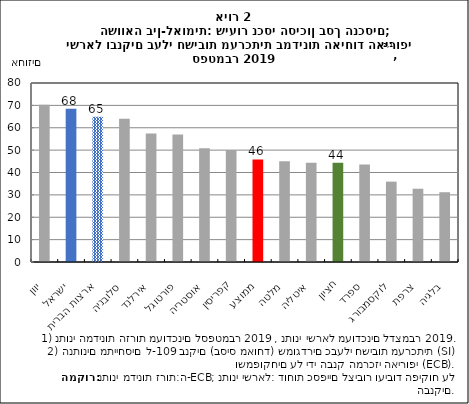
| Category | נכסי סיכון בסך הנכסים |
|---|---|
| יוון | 70.334 |
| ישראל | 68.467 |
| ארצות הברית | 64.958 |
| סלובניה | 64.039 |
| אירלנד | 57.43 |
| פורטוגל | 57.008 |
| אוסטריה | 50.797 |
| קפריסין | 50.095 |
| ממוצע | 45.824 |
| מלטה | 44.999 |
| איטליה | 44.319 |
| חציון | 44.319 |
| ספרד | 43.598 |
| לוקסמבורג | 35.916 |
| צרפת | 32.746 |
| בלגיה | 31.188 |